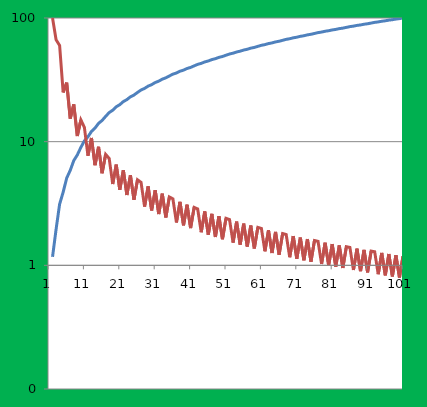
| Category | Series 0 | Series 1 |
|---|---|---|
| 0 | 0 | 0 |
| 1 | 1.172 | 100 |
| 2 | 1.953 | 66.667 |
| 3 | 3.125 | 60 |
| 4 | 3.906 | 25 |
| 5 | 5.078 | 30 |
| 6 | 5.859 | 15.385 |
| 7 | 7.031 | 20 |
| 8 | 7.812 | 11.111 |
| 9 | 8.984 | 15 |
| 10 | 10.156 | 13.043 |
| 11 | 10.938 | 7.692 |
| 12 | 12.109 | 10.714 |
| 13 | 12.891 | 6.452 |
| 14 | 14.062 | 9.091 |
| 15 | 14.844 | 5.556 |
| 16 | 16.016 | 7.895 |
| 17 | 17.188 | 7.317 |
| 18 | 17.969 | 4.545 |
| 19 | 19.141 | 6.522 |
| 20 | 19.922 | 4.082 |
| 21 | 21.094 | 5.882 |
| 22 | 21.875 | 3.704 |
| 23 | 23.047 | 5.357 |
| 24 | 23.828 | 3.39 |
| 25 | 25 | 4.918 |
| 26 | 26.172 | 4.688 |
| 27 | 26.953 | 2.985 |
| 28 | 28.125 | 4.348 |
| 29 | 28.906 | 2.778 |
| 30 | 30.078 | 4.054 |
| 31 | 30.859 | 2.597 |
| 32 | 32.031 | 3.797 |
| 33 | 32.812 | 2.439 |
| 34 | 33.984 | 3.571 |
| 35 | 35.156 | 3.448 |
| 36 | 35.938 | 2.222 |
| 37 | 37.109 | 3.261 |
| 38 | 37.891 | 2.105 |
| 39 | 39.062 | 3.093 |
| 40 | 39.844 | 2 |
| 41 | 41.016 | 2.941 |
| 42 | 42.188 | 2.857 |
| 43 | 42.969 | 1.852 |
| 44 | 44.141 | 2.727 |
| 45 | 44.922 | 1.77 |
| 46 | 46.094 | 2.609 |
| 47 | 46.875 | 1.695 |
| 48 | 48.047 | 2.5 |
| 49 | 48.828 | 1.626 |
| 50 | 50 | 2.4 |
| 51 | 51.172 | 2.344 |
| 52 | 51.953 | 1.527 |
| 53 | 53.125 | 2.256 |
| 54 | 53.906 | 1.471 |
| 55 | 55.078 | 2.174 |
| 56 | 55.859 | 1.418 |
| 57 | 57.031 | 2.098 |
| 58 | 57.812 | 1.37 |
| 59 | 58.984 | 2.027 |
| 60 | 60.156 | 1.987 |
| 61 | 60.938 | 1.299 |
| 62 | 62.109 | 1.923 |
| 63 | 62.891 | 1.258 |
| 64 | 64.062 | 1.863 |
| 65 | 64.844 | 1.22 |
| 66 | 66.016 | 1.807 |
| 67 | 67.188 | 1.775 |
| 68 | 67.969 | 1.163 |
| 69 | 69.141 | 1.724 |
| 70 | 69.922 | 1.13 |
| 71 | 71.094 | 1.676 |
| 72 | 71.875 | 1.099 |
| 73 | 73.047 | 1.63 |
| 74 | 73.828 | 1.07 |
| 75 | 75 | 1.587 |
| 76 | 76.172 | 1.562 |
| 77 | 76.953 | 1.026 |
| 78 | 78.125 | 1.523 |
| 79 | 78.906 | 1 |
| 80 | 80.078 | 1.485 |
| 81 | 80.859 | 0.976 |
| 82 | 82.031 | 1.449 |
| 83 | 82.812 | 0.952 |
| 84 | 83.984 | 1.415 |
| 85 | 85.156 | 1.395 |
| 86 | 85.938 | 0.917 |
| 87 | 87.109 | 1.364 |
| 88 | 87.891 | 0.897 |
| 89 | 89.062 | 1.333 |
| 90 | 89.844 | 0.877 |
| 91 | 91.016 | 1.304 |
| 92 | 92.188 | 1.288 |
| 93 | 92.969 | 0.847 |
| 94 | 94.141 | 1.261 |
| 95 | 94.922 | 0.83 |
| 96 | 96.094 | 1.235 |
| 97 | 96.875 | 0.813 |
| 98 | 98.047 | 1.21 |
| 99 | 98.828 | 0.797 |
| 100 | 100 | 1.186 |